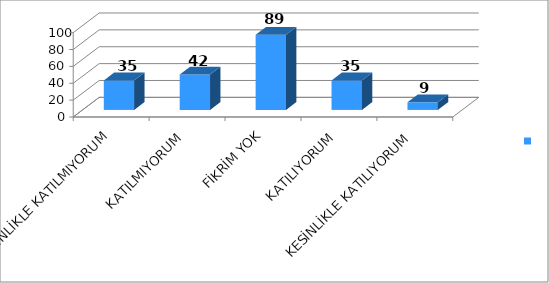
| Category | Series 0 |
|---|---|
| KESİNLİKLE KATILMIYORUM | 35 |
| KATILMIYORUM | 42 |
| FİKRİM YOK | 89 |
| KATILIYORUM | 35 |
| KESİNLİKLE KATILIYORUM | 9 |